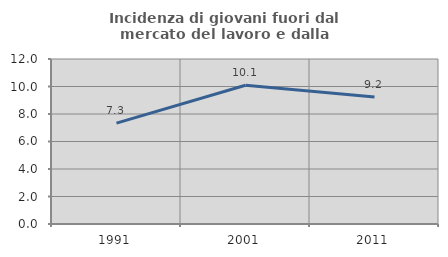
| Category | Incidenza di giovani fuori dal mercato del lavoro e dalla formazione  |
|---|---|
| 1991.0 | 7.338 |
| 2001.0 | 10.093 |
| 2011.0 | 9.228 |